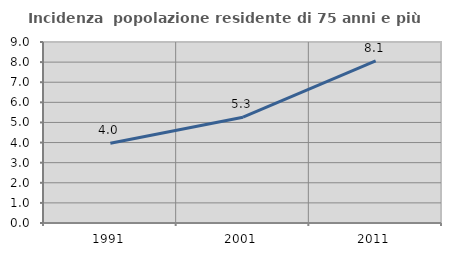
| Category | Incidenza  popolazione residente di 75 anni e più |
|---|---|
| 1991.0 | 3.965 |
| 2001.0 | 5.262 |
| 2011.0 | 8.059 |